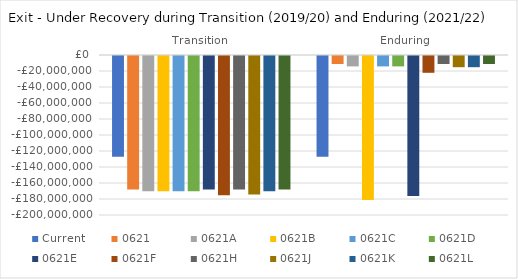
| Category | Current | 0621 | 0621A | 0621B | 0621C | 0621D | 0621E | 0621F | 0621H | 0621J | 0621K | 0621L |
|---|---|---|---|---|---|---|---|---|---|---|---|---|
| Transition | -126000000 | -167000000 | -169000000 | -169000000 | -169000000 | -169000000 | -167000000 | -174000000 | -167000000 | -173000000 | -169000000 | -167000000 |
| Enduring | -126000000 | -10000000 | -13000000 | -180000000 | -13000000 | -13000000 | -175000000 | -21000000 | -10000000 | -14000000 | -14000000 | -10000000 |